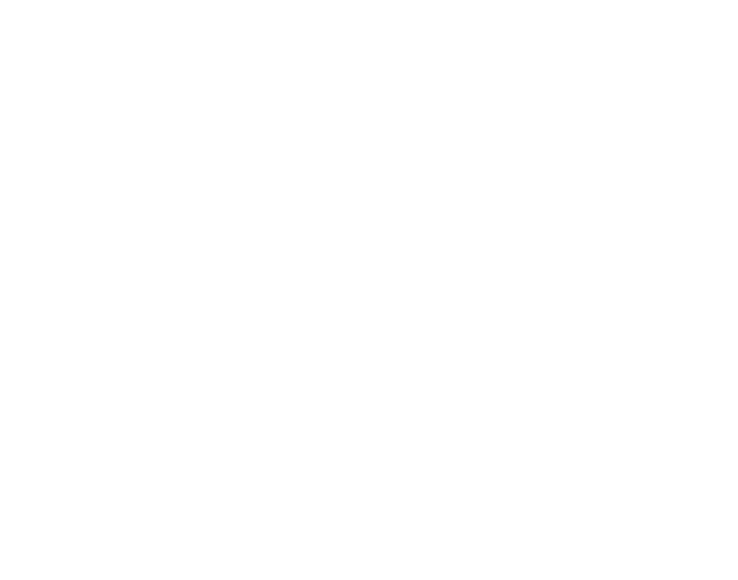
| Category | Series 0 |
|---|---|
| RECYCLABLES | 0 |
| RECYCLABLES incl. possible recyclables | 0 |
| Tissue Paper  | 0 |
| ORGANIC WASTE | 0 |
| Incontinence wear / nappies | 0 |
| Clinical Non-Risk | 0 |
| Clinical Risk | 0 |
| Composite Covers | 0 |
| Aprons & gowns | 0 |
| Plastic Gloves | 0 |
| Unused material | 0 |
| All other | 0 |